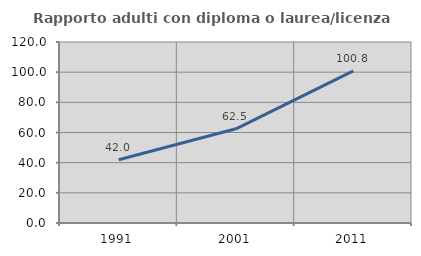
| Category | Rapporto adulti con diploma o laurea/licenza media  |
|---|---|
| 1991.0 | 41.975 |
| 2001.0 | 62.452 |
| 2011.0 | 100.82 |